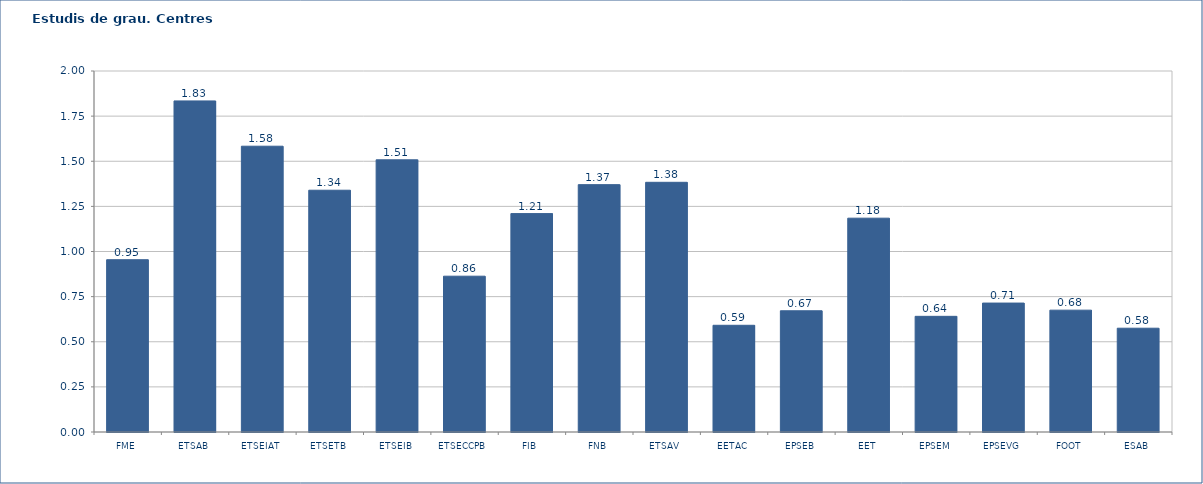
| Category | 2011-12 |
|---|---|
| FME | 0.955 |
| ETSAB | 1.834 |
| ETSEIAT | 1.583 |
| ETSETB | 1.339 |
| ETSEIB | 1.508 |
| ETSECCPB | 0.863 |
| FIB | 1.21 |
| FNB | 1.37 |
| ETSAV | 1.383 |
| EETAC | 0.591 |
| EPSEB | 0.672 |
| EET | 1.185 |
| EPSEM | 0.641 |
| EPSEVG | 0.714 |
| FOOT | 0.675 |
| ESAB | 0.575 |